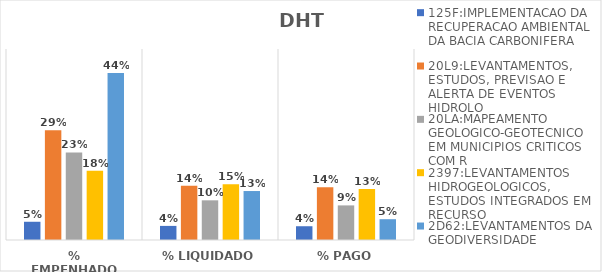
| Category | 125F:IMPLEMENTACAO DA RECUPERACAO AMBIENTAL DA BACIA CARBONIFERA | 20L9:LEVANTAMENTOS, ESTUDOS, PREVISAO E ALERTA DE EVENTOS HIDROLO | 20LA:MAPEAMENTO GEOLOGICO-GEOTECNICO EM MUNICIPIOS CRITICOS COM R | 2397:LEVANTAMENTOS HIDROGEOLOGICOS, ESTUDOS INTEGRADOS EM RECURSO | 2D62:LEVANTAMENTOS DA GEODIVERSIDADE |
|---|---|---|---|---|---|
| % EMPENHADO | 0.048 | 0.287 | 0.229 | 0.181 | 0.437 |
| % LIQUIDADO | 0.037 | 0.142 | 0.104 | 0.146 | 0.128 |
| % PAGO | 0.036 | 0.138 | 0.091 | 0.134 | 0.054 |